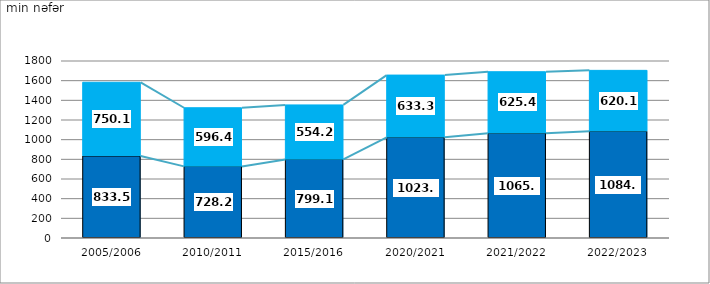
| Category |     şəhər   urban   |     kənd   rural    |
|---|---|---|
| 2005/2006 | 833.5 | 750.1 |
| 2010/2011 | 728.2 | 596.4 |
| 2015/2016 | 799.1 | 554.2 |
| 2020/2021 | 1023.5 | 633.3 |
| 2021/2022 | 1065.5 | 625.4 |
| 2022/2023 | 1084.7 | 620.1 |